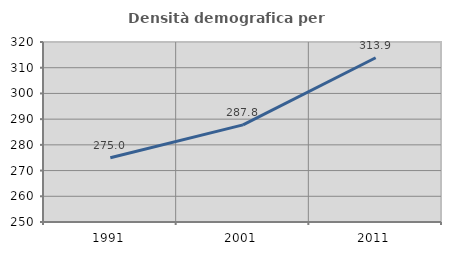
| Category | Densità demografica |
|---|---|
| 1991.0 | 275.017 |
| 2001.0 | 287.77 |
| 2011.0 | 313.872 |